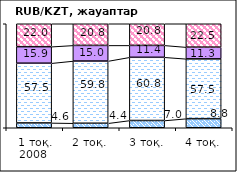
| Category | позитивно | не повлияло | негативно | не знаю |
|---|---|---|---|---|
| 1 тоқ. 2008  | 4.63 | 57.46 | 15.87 | 22.04 |
| 2 тоқ. | 4.35 | 59.81 | 15.03 | 20.81 |
| 3 тоқ. | 6.98 | 60.77 | 11.43 | 20.82 |
| 4 тоқ. | 8.75 | 57.49 | 11.27 | 22.48 |